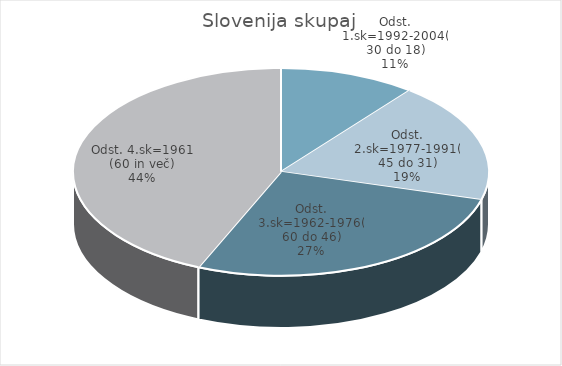
| Category | Slovenija skupaj |
|---|---|
| Odst. 1.sk=1992-2004(30 do 18) | 4.39 |
| Odst. 2.sk=1977-1991(45 do 31) | 7.74 |
| Odst. 3.sk=1962-1976(60 do 46) | 11.21 |
| Odst. 4.sk=1961 (60 in več) | 17.98 |